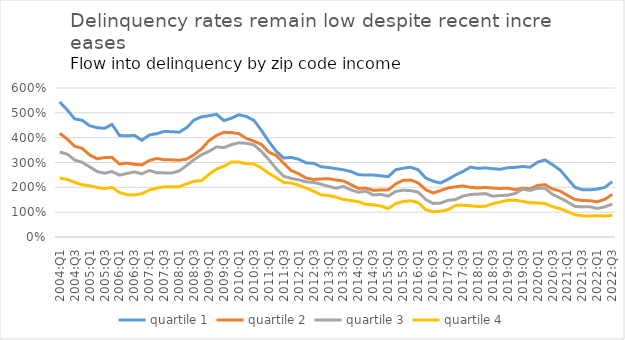
| Category | quartile 1 | quartile 2 | quartile 3 | quartile 4 |
|---|---|---|---|---|
| 2004:Q1 | 5.438 | 4.178 | 3.42 | 2.375 |
| 2004:Q2 | 5.118 | 3.943 | 3.338 | 2.314 |
| 2004:Q3 | 4.758 | 3.654 | 3.103 | 2.201 |
| 2004:Q4 | 4.7 | 3.57 | 3.006 | 2.104 |
| 2005:Q1 | 4.484 | 3.305 | 2.827 | 2.063 |
| 2005:Q2 | 4.403 | 3.149 | 2.635 | 1.997 |
| 2005:Q3 | 4.376 | 3.199 | 2.568 | 1.95 |
| 2005:Q4 | 4.534 | 3.209 | 2.635 | 2 |
| 2006:Q1 | 4.088 | 2.937 | 2.492 | 1.792 |
| 2006:Q2 | 4.072 | 2.975 | 2.556 | 1.707 |
| 2006:Q3 | 4.093 | 2.928 | 2.621 | 1.693 |
| 2006:Q4 | 3.895 | 2.902 | 2.545 | 1.74 |
| 2007:Q1 | 4.109 | 3.082 | 2.681 | 1.888 |
| 2007:Q2 | 4.161 | 3.163 | 2.586 | 1.97 |
| 2007:Q3 | 4.252 | 3.11 | 2.582 | 2.02 |
| 2007:Q4 | 4.239 | 3.107 | 2.573 | 2.018 |
| 2008:Q1 | 4.219 | 3.091 | 2.66 | 2.026 |
| 2008:Q2 | 4.406 | 3.135 | 2.879 | 2.141 |
| 2008:Q3 | 4.714 | 3.316 | 3.12 | 2.246 |
| 2008:Q4 | 4.839 | 3.55 | 3.314 | 2.272 |
| 2009:Q1 | 4.883 | 3.882 | 3.45 | 2.526 |
| 2009:Q2 | 4.939 | 4.092 | 3.63 | 2.734 |
| 2009:Q3 | 4.686 | 4.216 | 3.6 | 2.851 |
| 2009:Q4 | 4.784 | 4.204 | 3.72 | 3.02 |
| 2010:Q1 | 4.923 | 4.161 | 3.793 | 3.016 |
| 2010:Q2 | 4.851 | 3.968 | 3.776 | 2.953 |
| 2010:Q3 | 4.697 | 3.86 | 3.712 | 2.948 |
| 2010:Q4 | 4.299 | 3.732 | 3.447 | 2.782 |
| 2011:Q1 | 3.849 | 3.416 | 3.118 | 2.564 |
| 2011:Q2 | 3.451 | 3.281 | 2.75 | 2.386 |
| 2011:Q3 | 3.182 | 2.974 | 2.447 | 2.199 |
| 2011:Q4 | 3.204 | 2.675 | 2.361 | 2.172 |
| 2012:Q1 | 3.132 | 2.548 | 2.3 | 2.086 |
| 2012:Q2 | 2.984 | 2.374 | 2.221 | 1.972 |
| 2012:Q3 | 2.968 | 2.318 | 2.198 | 1.848 |
| 2012:Q4 | 2.829 | 2.337 | 2.127 | 1.698 |
| 2013:Q1 | 2.8 | 2.348 | 2.042 | 1.671 |
| 2013:Q2 | 2.752 | 2.293 | 1.963 | 1.604 |
| 2013:Q3 | 2.707 | 2.255 | 2.038 | 1.509 |
| 2013:Q4 | 2.636 | 2.109 | 1.897 | 1.467 |
| 2014:Q1 | 2.509 | 1.955 | 1.804 | 1.42 |
| 2014:Q2 | 2.496 | 1.97 | 1.845 | 1.312 |
| 2014:Q3 | 2.494 | 1.878 | 1.691 | 1.297 |
| 2014:Q4 | 2.465 | 1.894 | 1.715 | 1.245 |
| 2015:Q1 | 2.429 | 1.898 | 1.646 | 1.144 |
| 2015:Q2 | 2.711 | 2.139 | 1.837 | 1.347 |
| 2015:Q3 | 2.769 | 2.282 | 1.887 | 1.426 |
| 2015:Q4 | 2.81 | 2.292 | 1.868 | 1.459 |
| 2016:Q1 | 2.709 | 2.179 | 1.809 | 1.386 |
| 2016:Q2 | 2.378 | 1.908 | 1.514 | 1.104 |
| 2016:Q3 | 2.246 | 1.774 | 1.351 | 1.017 |
| 2016:Q4 | 2.174 | 1.87 | 1.365 | 1.035 |
| 2017:Q1 | 2.321 | 1.975 | 1.477 | 1.099 |
| 2017:Q2 | 2.494 | 2.022 | 1.506 | 1.273 |
| 2017:Q3 | 2.636 | 2.058 | 1.649 | 1.282 |
| 2017:Q4 | 2.815 | 1.998 | 1.711 | 1.259 |
| 2018:Q1 | 2.763 | 1.976 | 1.727 | 1.229 |
| 2018:Q2 | 2.783 | 1.996 | 1.749 | 1.237 |
| 2018:Q3 | 2.749 | 1.972 | 1.642 | 1.343 |
| 2018:Q4 | 2.728 | 1.956 | 1.67 | 1.407 |
| 2019:Q1 | 2.791 | 1.964 | 1.683 | 1.48 |
| 2019:Q2 | 2.804 | 1.908 | 1.754 | 1.481 |
| 2019:Q3 | 2.839 | 1.965 | 1.926 | 1.433 |
| 2019:Q4 | 2.809 | 1.934 | 1.877 | 1.378 |
| 2020:Q1 | 3.014 | 2.078 | 1.967 | 1.373 |
| 2020:Q2 | 3.105 | 2.108 | 1.959 | 1.345 |
| 2020:Q3 | 2.91 | 1.933 | 1.718 | 1.221 |
| 2020:Q4 | 2.702 | 1.852 | 1.574 | 1.144 |
| 2021:Q1 | 2.352 | 1.675 | 1.413 | 1.024 |
| 2021:Q2 | 2.002 | 1.512 | 1.233 | 0.895 |
| 2021:Q3 | 1.9 | 1.468 | 1.213 | 0.852 |
| 2021:Q4 | 1.899 | 1.462 | 1.217 | 0.846 |
| 2022:Q1 | 1.928 | 1.418 | 1.148 | 0.859 |
| 2022:Q2 | 1.998 | 1.518 | 1.216 | 0.844 |
| 2022:Q3 | 2.229 | 1.716 | 1.326 | 0.873 |